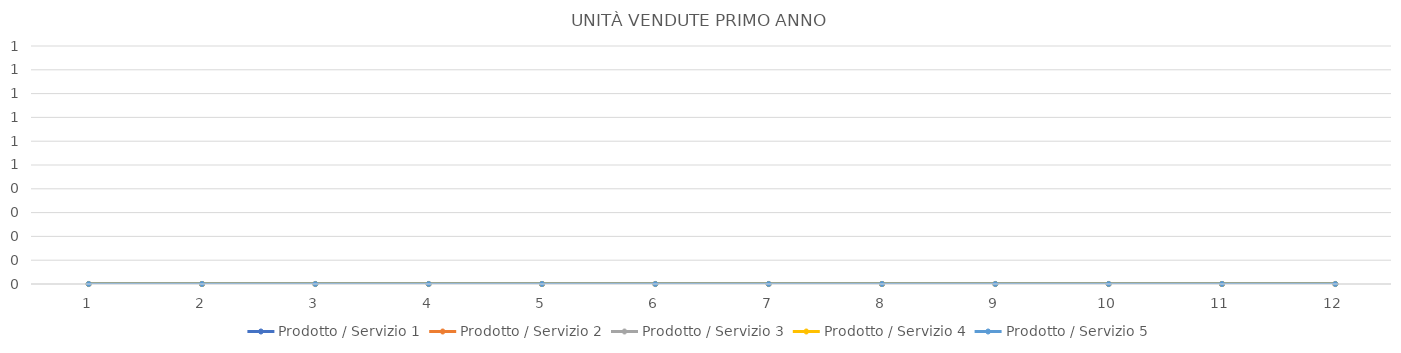
| Category | Prodotto / Servizio 1 | Prodotto / Servizio 2 | Prodotto / Servizio 3 | Prodotto / Servizio 4 | Prodotto / Servizio 5 |
|---|---|---|---|---|---|
| 0 | 0 | 0 | 0 | 0 | 0 |
| 1 | 0 | 0 | 0 | 0 | 0 |
| 2 | 0 | 0 | 0 | 0 | 0 |
| 3 | 0 | 0 | 0 | 0 | 0 |
| 4 | 0 | 0 | 0 | 0 | 0 |
| 5 | 0 | 0 | 0 | 0 | 0 |
| 6 | 0 | 0 | 0 | 0 | 0 |
| 7 | 0 | 0 | 0 | 0 | 0 |
| 8 | 0 | 0 | 0 | 0 | 0 |
| 9 | 0 | 0 | 0 | 0 | 0 |
| 10 | 0 | 0 | 0 | 0 | 0 |
| 11 | 0 | 0 | 0 | 0 | 0 |